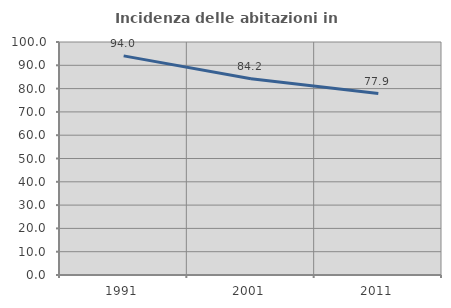
| Category | Incidenza delle abitazioni in proprietà  |
|---|---|
| 1991.0 | 94.04 |
| 2001.0 | 84.211 |
| 2011.0 | 77.852 |